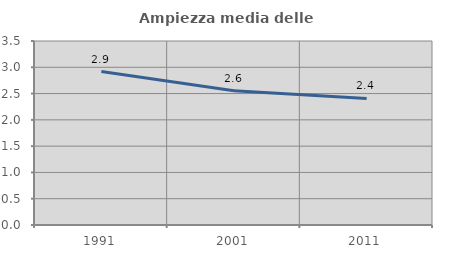
| Category | Ampiezza media delle famiglie |
|---|---|
| 1991.0 | 2.92 |
| 2001.0 | 2.553 |
| 2011.0 | 2.407 |